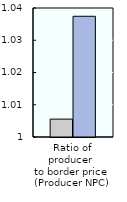
| Category | 2000-02 | 2018-20 |
|---|---|---|
| Ratio of producer 
to border price 
(Producer NPC) | 1.006 | 1.037 |